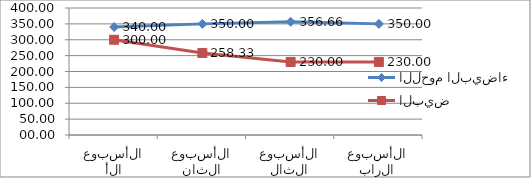
| Category | اللحوم البيضاء | البيض |
|---|---|---|
| 0 | 340 | 300 |
| 1 | 350 | 258.33 |
| 2 | 356.66 | 230 |
| 3 | 350 | 230 |